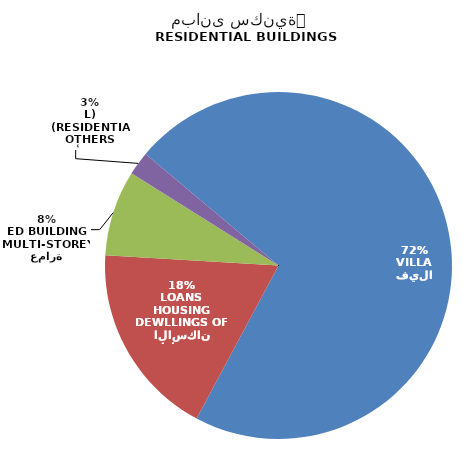
| Category | مبانى سكنية
RESIDENTIAL BUILDINGS |
|---|---|
| فيلا
VILLA | 2680 |
| مساكن قروض الاسكان
DEWLLINGS OF HOUSING LOANS | 677 |
| عمارة
MULTI-STOREYED BUILDING | 298 |
| أخرى
OTHERS (RESIDENTIAL) | 82 |